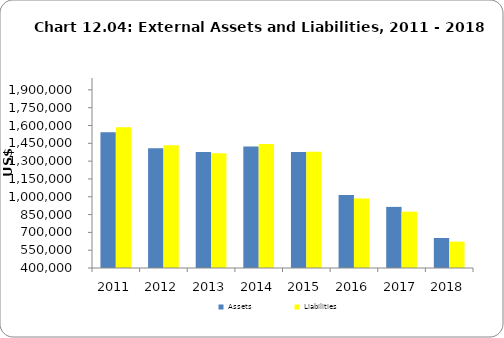
| Category | Assets | Liabilities |
|---|---|---|
| 2011.0 | 1543735 | 1584592 |
| 2012.0 | 1409321 | 1434218 |
| 2013.0 | 1377200 | 1366800 |
| 2014.0 | 1423029 | 1443356 |
| 2015.0 | 1377000 | 1380000 |
| 2016.0 | 1015623 | 985470 |
| 2017.0 | 914692 | 874427 |
| 2018.0 | 652463 | 622186 |